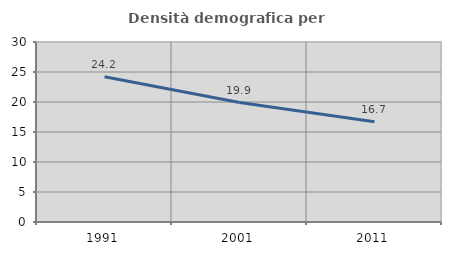
| Category | Densità demografica |
|---|---|
| 1991.0 | 24.223 |
| 2001.0 | 19.912 |
| 2011.0 | 16.726 |